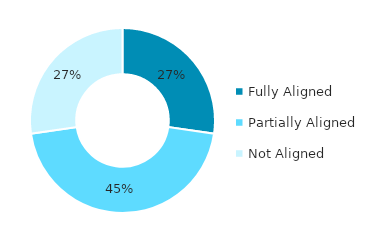
| Category | Series 0 |
|---|---|
| Fully Aligned | 0.273 |
| Partially Aligned | 0.455 |
| Not Aligned | 0.273 |